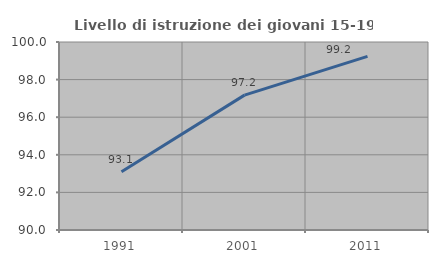
| Category | Livello di istruzione dei giovani 15-19 anni |
|---|---|
| 1991.0 | 93.103 |
| 2001.0 | 97.175 |
| 2011.0 | 99.237 |